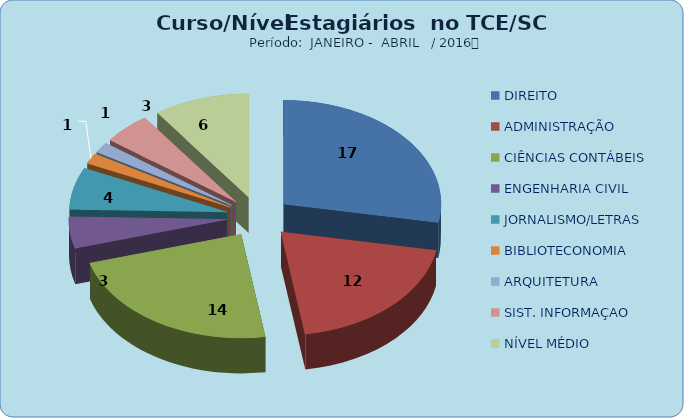
| Category | Series 0 |
|---|---|
| DIREITO | 17 |
| ADMINISTRAÇÃO | 12 |
| CIÊNCIAS CONTÁBEIS | 14 |
| ENGENHARIA CIVIL | 3 |
| JORNALISMO/LETRAS | 4 |
| BIBLIOTECONOMIA | 1 |
| ARQUITETURA | 1 |
| SIST. INFORMAÇAO | 3 |
| NÍVEL MÉDIO | 6 |